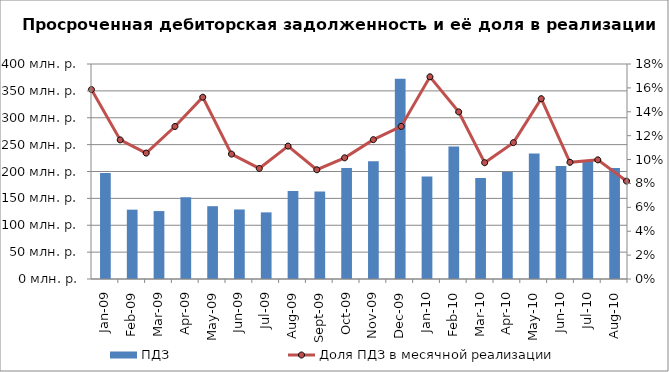
| Category | ПДЗ |
|---|---|
| 2009-01-01 | 197280000 |
| 2009-02-01 | 128990000 |
| 2009-03-01 | 126380000 |
| 2009-04-01 | 152060000 |
| 2009-05-01 | 135470000 |
| 2009-06-01 | 129360000 |
| 2009-07-01 | 123970000 |
| 2009-08-01 | 163780000 |
| 2009-09-01 | 162690000 |
| 2009-10-01 | 206620000 |
| 2009-11-01 | 218890000 |
| 2009-12-01 | 372410000 |
| 2010-01-01 | 190590000 |
| 2010-02-01 | 246380000 |
| 2010-03-01 | 187690000 |
| 2010-04-01 | 199270000 |
| 2010-05-01 | 233400000 |
| 2010-06-01 | 210110000 |
| 2010-07-01 | 220440000 |
| 2010-08-01 | 206320000 |